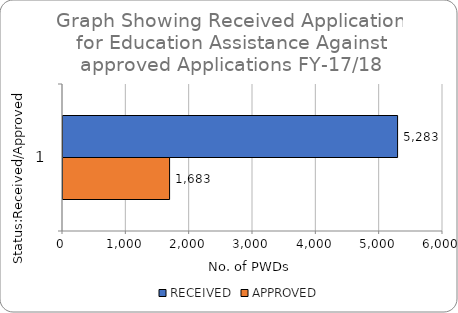
| Category | RECEIVED | APPROVED |
|---|---|---|
| 0 | 5283 | 1683 |